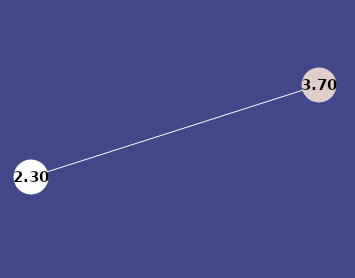
| Category | Series 0 |
|---|---|
| 0 | 2.298 |
| 1 | 3.702 |